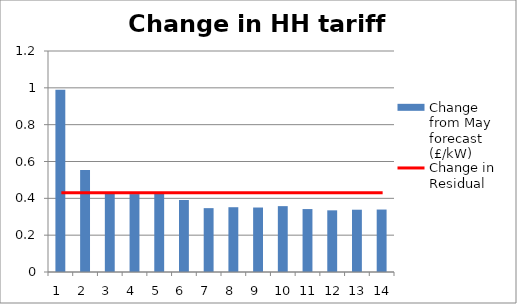
| Category | Change from May forecast (£/kW) |
|---|---|
| 1.0 | 0.99 |
| 2.0 | 0.554 |
| 3.0 | 0.433 |
| 4.0 | 0.423 |
| 5.0 | 0.429 |
| 6.0 | 0.391 |
| 7.0 | 0.347 |
| 8.0 | 0.352 |
| 9.0 | 0.35 |
| 10.0 | 0.358 |
| 11.0 | 0.342 |
| 12.0 | 0.335 |
| 13.0 | 0.338 |
| 14.0 | 0.339 |